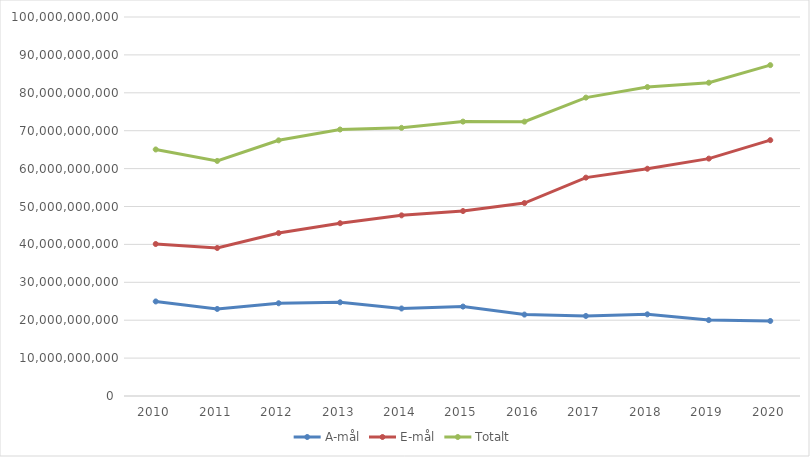
| Category | A-mål | E-mål | Totalt |
|---|---|---|---|
| 2010.0 | 24945752674 | 40103634064 | 65049386738 |
| 2011.0 | 22969806320 | 39053876936 | 62023683256 |
| 2012.0 | 24472022718 | 42986573713 | 67458596431 |
| 2013.0 | 24723698977 | 45590047798 | 70313746775 |
| 2014.0 | 23090343570 | 47662609473 | 70752953043 |
| 2015.0 | 23596671918 | 48802048954 | 72398720872 |
| 2016.0 | 21481652882 | 50908704749 | 72390357631 |
| 2017.0 | 21115606503 | 57616792687 | 78732399190 |
| 2018.0 | 21551242435 | 59962467055 | 81513709490 |
| 2019.0 | 20027727930 | 62636899184 | 82664627114 |
| 2020.0 | 19796344372 | 67504169122 | 87300513494 |